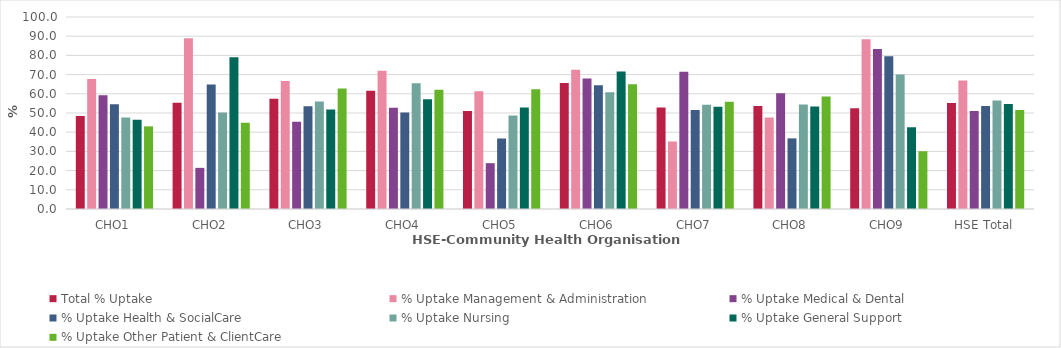
| Category | Total % Uptake | % Uptake Management & Administration | % Uptake Medical & Dental | % Uptake Health & SocialCare | % Uptake Nursing | % Uptake General Support | % Uptake Other Patient & ClientCare |
|---|---|---|---|---|---|---|---|
| CHO1 | 48.446 | 67.647 | 59.211 | 54.545 | 47.642 | 46.526 | 43.035 |
| CHO2 | 55.328 | 88.889 | 21.429 | 64.835 | 50.199 | 79.048 | 44.883 |
| CHO3 | 57.478 | 66.667 | 45.455 | 53.472 | 55.927 | 51.818 | 62.762 |
| CHO4 | 61.614 | 71.976 | 52.764 | 50.289 | 65.474 | 57.123 | 62.052 |
| CHO5 | 51.095 | 61.364 | 23.864 | 36.719 | 48.713 | 52.824 | 62.408 |
| CHO6 | 65.613 | 72.5 | 68 | 64.444 | 60.87 | 71.605 | 64.972 |
| CHO7 | 52.884 | 35.135 | 71.429 | 51.515 | 54.271 | 53.247 | 55.909 |
| CHO8 | 53.668 | 47.651 | 60.241 | 36.782 | 54.403 | 53.406 | 58.544 |
| CHO9 | 52.47 | 88.462 | 83.333 | 79.528 | 70.022 | 42.574 | 30.088 |
| HSE Total | 55.233 | 66.862 | 51.056 | 53.602 | 56.569 | 54.623 | 51.501 |